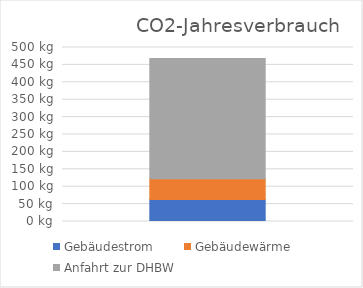
| Category | Gebäudestrom | Gebäudewärme | Anfahrt zur DHBW |
|---|---|---|---|
| 0 | 63 | 60 | 345.4 |